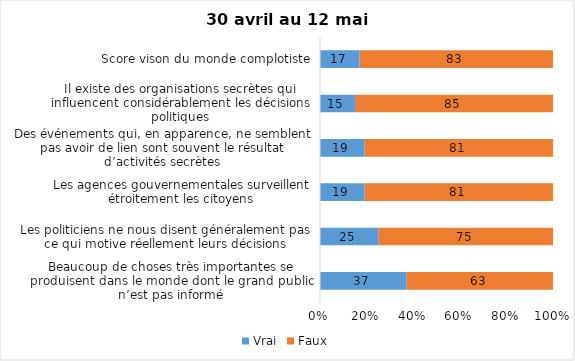
| Category | Vrai | Faux |
|---|---|---|
| Beaucoup de choses très importantes se produisent dans le monde dont le grand public n’est pas informé | 37 | 63 |
| Les politiciens ne nous disent généralement pas ce qui motive réellement leurs décisions | 25 | 75 |
| Les agences gouvernementales surveillent étroitement les citoyens | 19 | 81 |
| Des événements qui, en apparence, ne semblent pas avoir de lien sont souvent le résultat d’activités secrètes | 19 | 81 |
| Il existe des organisations secrètes qui influencent considérablement les décisions politiques | 15 | 85 |
| Score vison du monde complotiste | 17 | 83 |